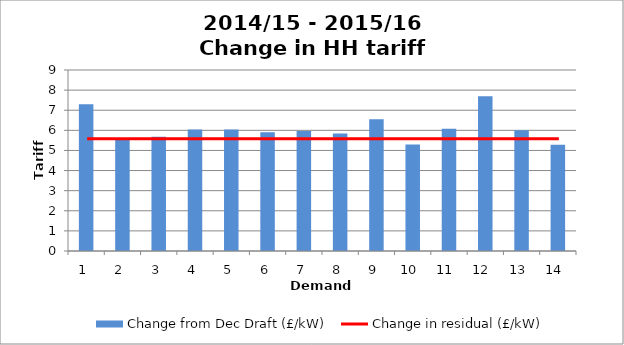
| Category | Change from Dec Draft (£/kW) |
|---|---|
| 1.0 | 7.301 |
| 2.0 | 5.553 |
| 3.0 | 5.68 |
| 4.0 | 6.043 |
| 5.0 | 6.039 |
| 6.0 | 5.905 |
| 7.0 | 5.967 |
| 8.0 | 5.847 |
| 9.0 | 6.549 |
| 10.0 | 5.292 |
| 11.0 | 6.08 |
| 12.0 | 7.69 |
| 13.0 | 6 |
| 14.0 | 5.28 |